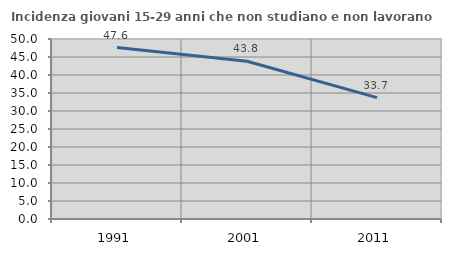
| Category | Incidenza giovani 15-29 anni che non studiano e non lavorano  |
|---|---|
| 1991.0 | 47.615 |
| 2001.0 | 43.822 |
| 2011.0 | 33.718 |